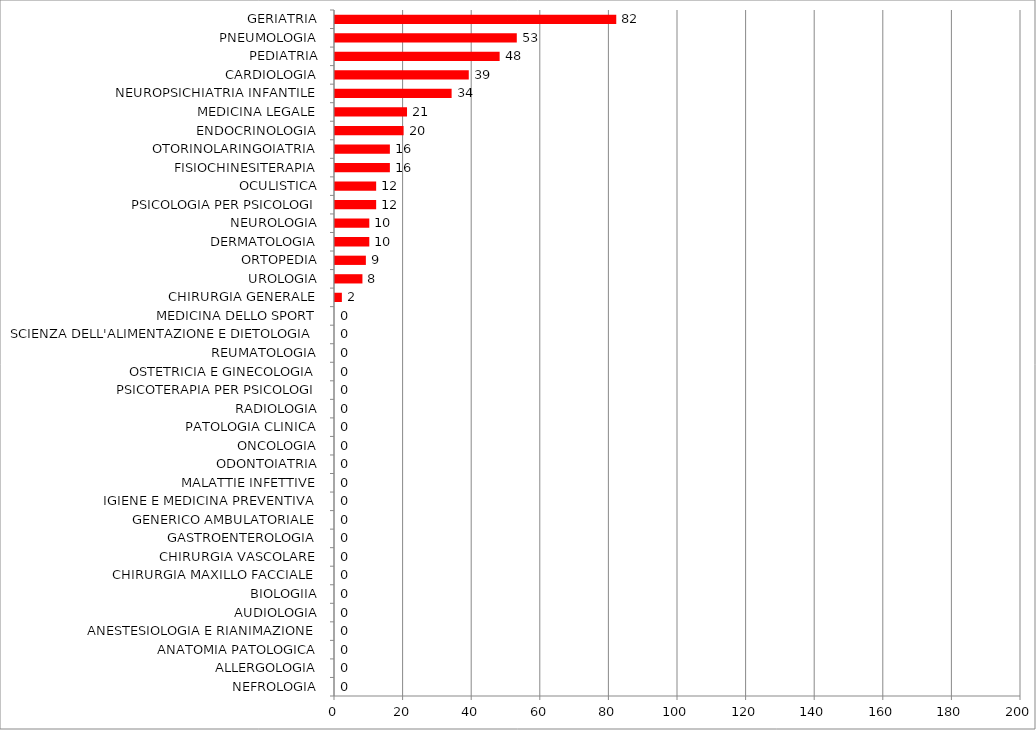
| Category | Series 0 |
|---|---|
| NEFROLOGIA | 0 |
| ALLERGOLOGIA | 0 |
| ANATOMIA PATOLOGICA | 0 |
| ANESTESIOLOGIA E RIANIMAZIONE | 0 |
| AUDIOLOGIA | 0 |
| BIOLOGIIA | 0 |
| CHIRURGIA MAXILLO FACCIALE | 0 |
| CHIRURGIA VASCOLARE | 0 |
| GASTROENTEROLOGIA | 0 |
| GENERICO AMBULATORIALE | 0 |
| IGIENE E MEDICINA PREVENTIVA | 0 |
| MALATTIE INFETTIVE | 0 |
| ODONTOIATRIA | 0 |
| ONCOLOGIA | 0 |
| PATOLOGIA CLINICA | 0 |
| RADIOLOGIA | 0 |
| PSICOTERAPIA PER PSICOLOGI | 0 |
| OSTETRICIA E GINECOLOGIA | 0 |
| REUMATOLOGIA | 0 |
| SCIENZA DELL'ALIMENTAZIONE E DIETOLOGIA | 0 |
| MEDICINA DELLO SPORT | 0 |
| CHIRURGIA GENERALE | 2 |
| UROLOGIA | 8 |
| ORTOPEDIA | 9 |
| DERMATOLOGIA | 10 |
| NEUROLOGIA | 10 |
| PSICOLOGIA PER PSICOLOGI | 12 |
| OCULISTICA | 12 |
| FISIOCHINESITERAPIA | 16 |
| OTORINOLARINGOIATRIA | 16 |
| ENDOCRINOLOGIA | 20 |
| MEDICINA LEGALE | 21 |
| NEUROPSICHIATRIA INFANTILE | 34 |
| CARDIOLOGIA | 39 |
| PEDIATRIA | 48 |
| PNEUMOLOGIA | 53 |
| GERIATRIA | 82 |